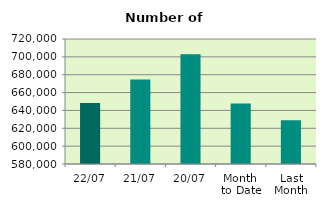
| Category | Series 0 |
|---|---|
| 22/07 | 648456 |
| 21/07 | 674566 |
| 20/07 | 702792 |
| Month 
to Date | 647888.625 |
| Last
Month | 628899 |